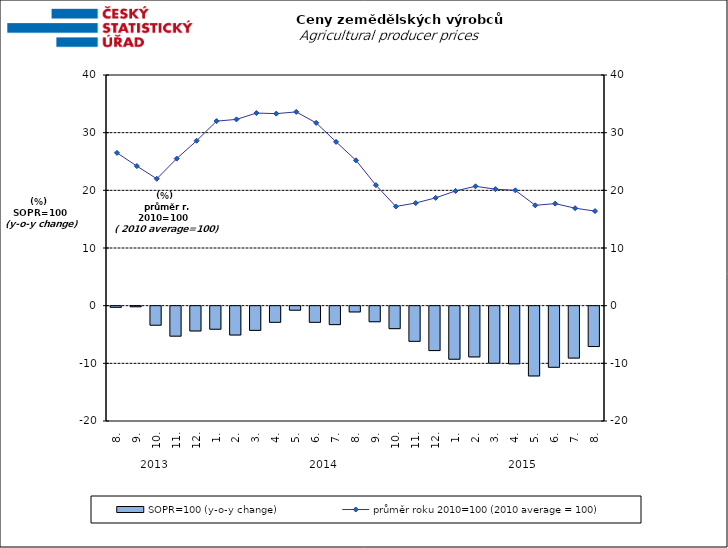
| Category | SOPR=100 (y-o-y change)   |
|---|---|
| 0 | -0.2 |
| 1 | -0.1 |
| 2 | -3.3 |
| 3 | -5.2 |
| 4 | -4.3 |
| 5 | -4 |
| 6 | -5 |
| 7 | -4.2 |
| 8 | -2.8 |
| 9 | -0.7 |
| 10 | -2.8 |
| 11 | -3.2 |
| 12 | -1 |
| 13 | -2.7 |
| 14 | -3.9 |
| 15 | -6.1 |
| 16 | -7.7 |
| 17 | -9.2 |
| 18 | -8.8 |
| 19 | -9.9 |
| 20 | -10 |
| 21 | -12.1 |
| 22 | -10.6 |
| 23 | -9 |
| 24 | -7 |